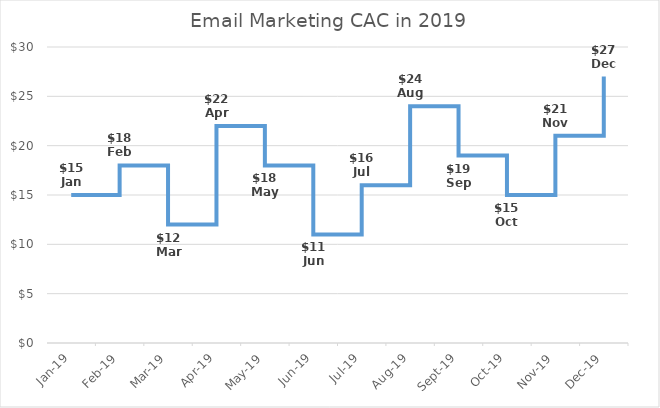
| Category | Series 0 |
|---|---|
| 2019-01-01 | 15 |
| 2019-02-01 | 15 |
| 2019-02-01 | 18 |
| 2019-03-01 | 18 |
| 2019-03-01 | 12 |
| 2019-04-01 | 12 |
| 2019-04-01 | 22 |
| 2019-05-01 | 22 |
| 2019-05-01 | 18 |
| 2019-06-01 | 18 |
| 2019-06-01 | 11 |
| 2019-07-01 | 11 |
| 2019-07-01 | 16 |
| 2019-08-01 | 16 |
| 2019-08-01 | 24 |
| 2019-09-01 | 24 |
| 2019-09-01 | 19 |
| 2019-10-01 | 19 |
| 2019-10-01 | 15 |
| 2019-11-01 | 15 |
| 2019-11-01 | 21 |
| 2019-12-01 | 21 |
| 2019-12-01 | 27 |